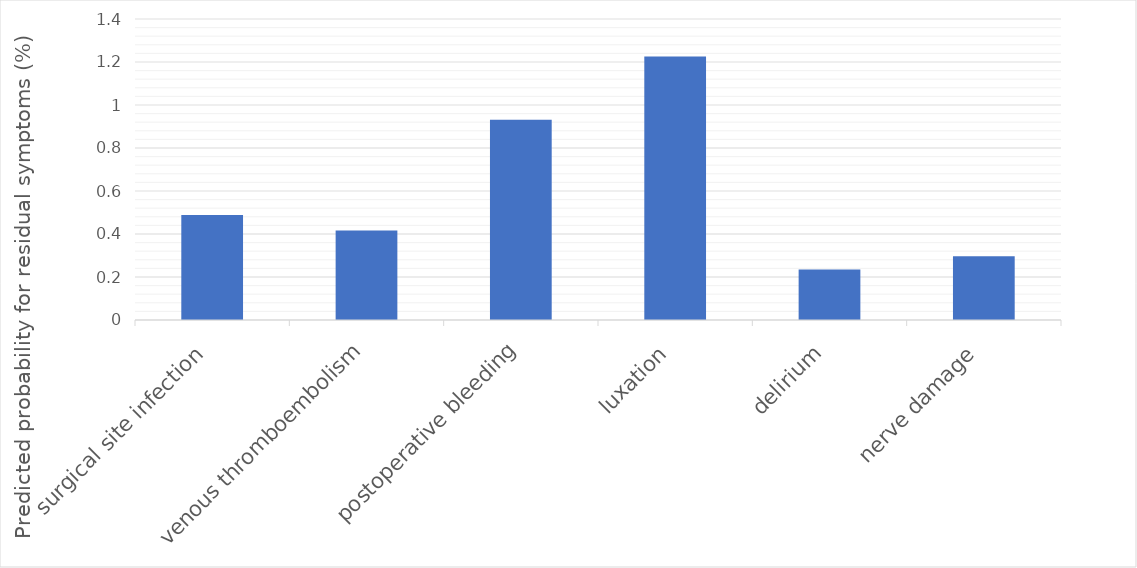
| Category | Predicted probability for residual symptoms (%) |
|---|---|
| surgical site infection | 0.488 |
| venous thromboembolism | 0.416 |
| postoperative bleeding | 0.931 |
| luxation | 1.226 |
| delirium | 0.235 |
| nerve damage | 0.296 |